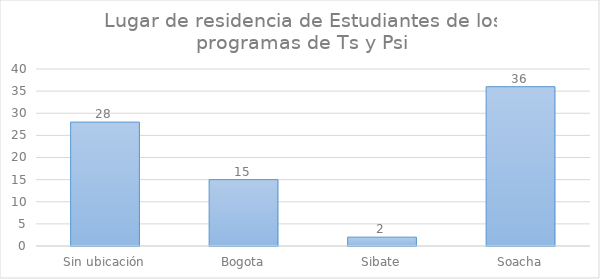
| Category | Series 0 |
|---|---|
| Sin ubicación | 28 |
| Bogota | 15 |
| Sibate | 2 |
| Soacha | 36 |